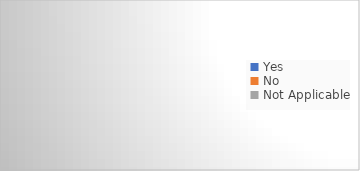
| Category | Series 0 |
|---|---|
| Yes | 0 |
| No | 0 |
| Not Applicable | 0 |